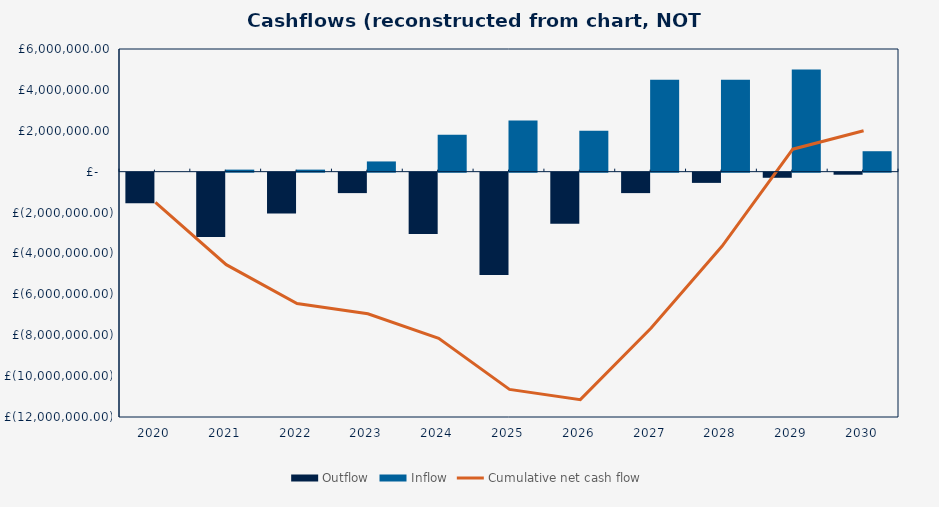
| Category | Outflow | Inflow |
|---|---|---|
| 2020.0 | -1500000 | 0 |
| 2021.0 | -3150000 | 100000 |
| 2022.0 | -2000000 | 100000 |
| 2023.0 | -1000000 | 500000 |
| 2024.0 | -3000000 | 1800000 |
| 2025.0 | -5000000 | 2500000 |
| 2026.0 | -2500000 | 2000000 |
| 2027.0 | -1000000 | 4500000 |
| 2028.0 | -500000 | 4500000 |
| 2029.0 | -250000 | 5000000 |
| 2030.0 | -100000 | 1000000 |